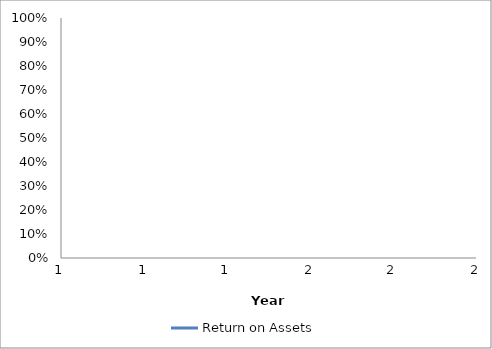
| Category | Return on Assets |
|---|---|
| 0 | 0 |
| 1 | 0 |
| 2 | 0 |
| 3 | 0 |
| 4 | 0 |
| 5 | 0 |
| 6 | 0 |
| 7 | 0 |
| 8 | 0 |
| 9 | 0 |